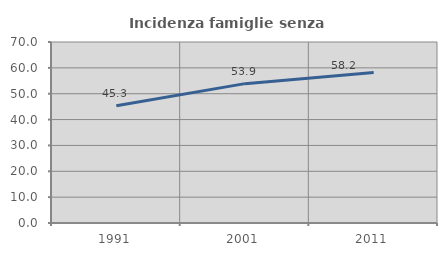
| Category | Incidenza famiglie senza nuclei |
|---|---|
| 1991.0 | 45.306 |
| 2001.0 | 53.898 |
| 2011.0 | 58.17 |